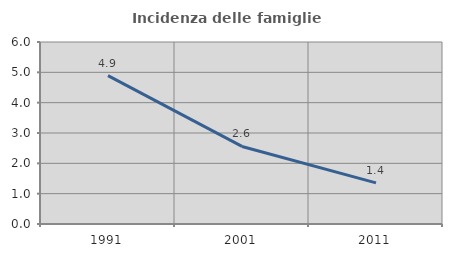
| Category | Incidenza delle famiglie numerose |
|---|---|
| 1991.0 | 4.893 |
| 2001.0 | 2.557 |
| 2011.0 | 1.357 |